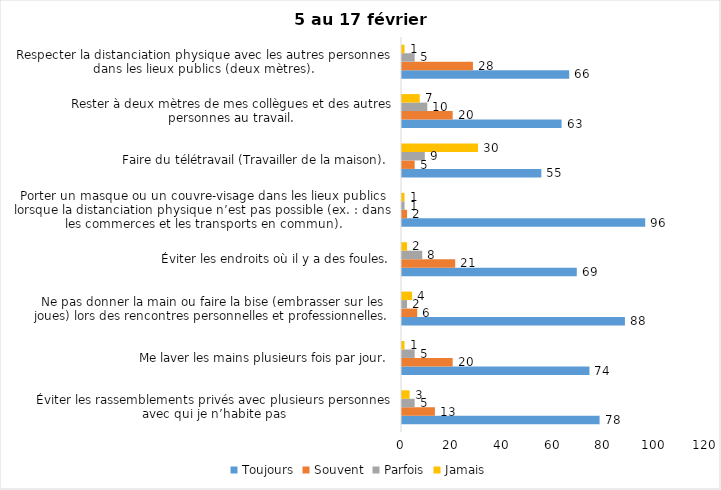
| Category | Toujours | Souvent | Parfois | Jamais |
|---|---|---|---|---|
| Éviter les rassemblements privés avec plusieurs personnes avec qui je n’habite pas | 78 | 13 | 5 | 3 |
| Me laver les mains plusieurs fois par jour. | 74 | 20 | 5 | 1 |
| Ne pas donner la main ou faire la bise (embrasser sur les joues) lors des rencontres personnelles et professionnelles. | 88 | 6 | 2 | 4 |
| Éviter les endroits où il y a des foules. | 69 | 21 | 8 | 2 |
| Porter un masque ou un couvre-visage dans les lieux publics lorsque la distanciation physique n’est pas possible (ex. : dans les commerces et les transports en commun). | 96 | 2 | 1 | 1 |
| Faire du télétravail (Travailler de la maison). | 55 | 5 | 9 | 30 |
| Rester à deux mètres de mes collègues et des autres personnes au travail. | 63 | 20 | 10 | 7 |
| Respecter la distanciation physique avec les autres personnes dans les lieux publics (deux mètres). | 66 | 28 | 5 | 1 |